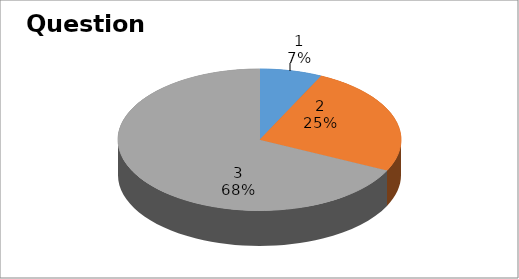
| Category | Series 0 |
|---|---|
| 0 | 2 |
| 1 | 7 |
| 2 | 19 |